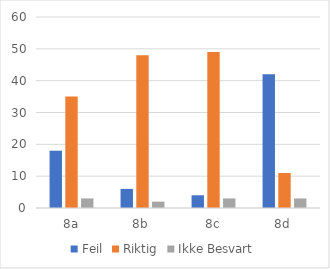
| Category | Feil | Riktig | Ikke Besvart |
|---|---|---|---|
| 8a | 18 | 35 | 3 |
| 8b | 6 | 48 | 2 |
| 8c | 4 | 49 | 3 |
| 8d | 42 | 11 | 3 |